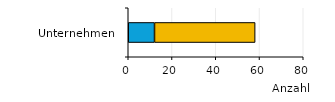
| Category | Öffentliche Unternehmen | Private und gemischtwirtschaftliche Unternehmen |
|---|---|---|
| 0 | 12 | 46 |